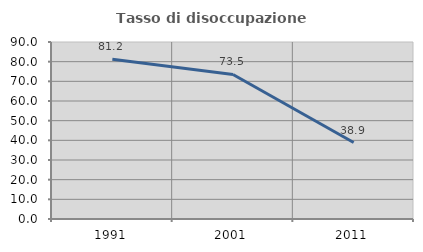
| Category | Tasso di disoccupazione giovanile  |
|---|---|
| 1991.0 | 81.215 |
| 2001.0 | 73.494 |
| 2011.0 | 38.889 |